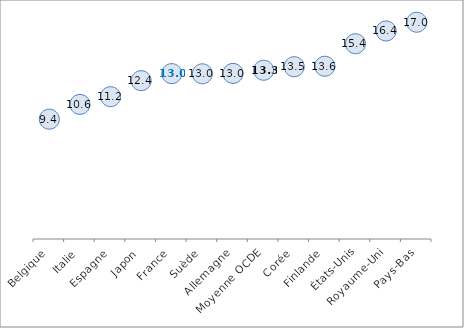
| Category | Second degré |
|---|---|
| Belgique | 9.419 |
| Italie | 10.58 |
| Espagne | 11.187 |
| Japon | 12.447 |
| France | 13 |
| Suède  | 12.984 |
| Allemagne | 13.017 |
| Moyenne OCDE | 13.264 |
| Corée | 13.544 |
| Finlande | 13.58 |
| États-Unis | 15.35 |
| Royaume-Uni | 16.35 |
| Pays-Bas | 17.037 |